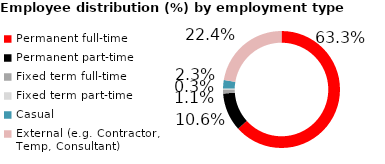
| Category | Series 0 |
|---|---|
| Permanent full-time | 0.633 |
| Permanent part-time | 0.106 |
| Fixed term full-time | 0.011 |
| Fixed term part-time | 0.003 |
| Casual | 0.023 |
| External (e.g. Contractor, Temp, Consultant) | 0.224 |